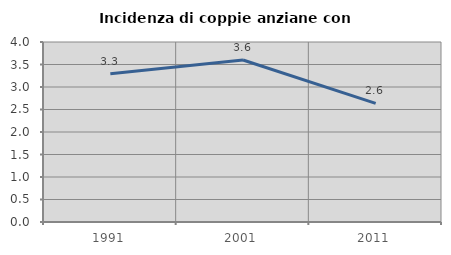
| Category | Incidenza di coppie anziane con figli |
|---|---|
| 1991.0 | 3.296 |
| 2001.0 | 3.6 |
| 2011.0 | 2.636 |